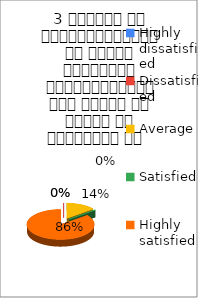
| Category | 3 शिक्षक का विद्यार्थियों के प्रति व्यव्हार मित्रतापूर्ण एवं सहयोग के भावना से परिपूर्ण था   |
|---|---|
| Highly dissatisfied | 0 |
| Dissatisfied | 0 |
| Average | 1 |
| Satisfied | 0 |
| Highly satisfied | 6 |